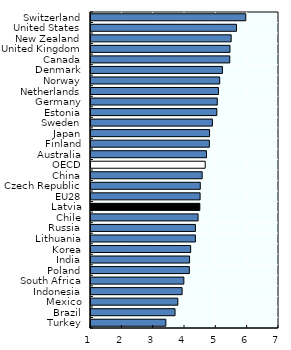
| Category | 2017-2018 |
|---|---|
| Turkey | 3.389 |
| Brazil | 3.682 |
| Mexico | 3.771 |
| Indonesia | 3.908 |
| South Africa | 3.963 |
| Poland | 4.139 |
| India | 4.146 |
| Korea | 4.181 |
| Lithuania | 4.332 |
| Russia | 4.333 |
| Chile | 4.417 |
| Latvia | 4.474 |
| EU28 | 4.482 |
| Czech Republic | 4.488 |
| China | 4.548 |
| OECD | 4.645 |
| Australia | 4.685 |
| Finland | 4.778 |
| Japan | 4.783 |
| Sweden | 4.875 |
| Estonia | 5.016 |
| Germany | 5.03 |
| Netherlands | 5.067 |
| Norway | 5.107 |
| Denmark | 5.195 |
| Canada | 5.429 |
| United Kingdom | 5.436 |
| New Zealand | 5.474 |
| United States | 5.644 |
| Switzerland | 5.94 |